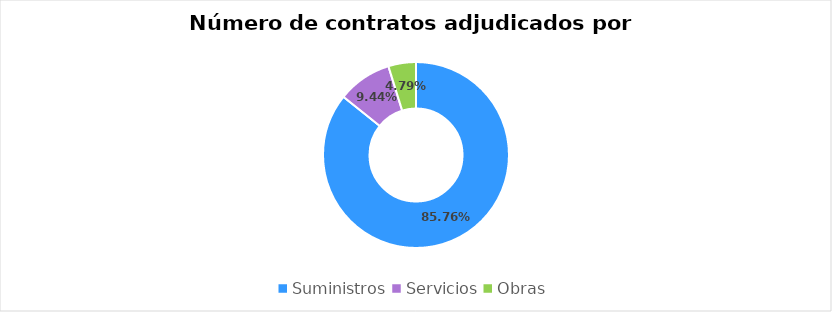
| Category | Series 0 |
|---|---|
| Suministros | 0.858 |
| Servicios | 0.094 |
| Obras | 0.048 |